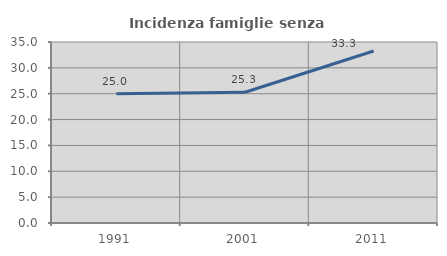
| Category | Incidenza famiglie senza nuclei |
|---|---|
| 1991.0 | 25 |
| 2001.0 | 25.293 |
| 2011.0 | 33.263 |